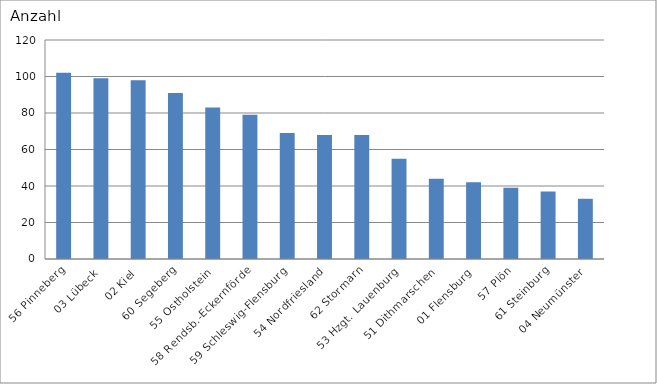
| Category | 56 Pinneberg 03 Lübeck 02 Kiel 60 Segeberg 55 Ostholstein 58 Rendsb.-Eckernförde 59 Schleswig-Flensburg 54 Nordfriesland 62 Stormarn 53 Hzgt. Lauenburg 51 Dithmarschen 01 Flensburg 57 Plön 61 Steinburg 04 Neumünster |
|---|---|
| 56 Pinneberg | 102 |
| 03 Lübeck | 99 |
| 02 Kiel | 98 |
| 60 Segeberg | 91 |
| 55 Ostholstein | 83 |
| 58 Rendsb.-Eckernförde | 79 |
| 59 Schleswig-Flensburg | 69 |
| 54 Nordfriesland | 68 |
| 62 Stormarn | 68 |
| 53 Hzgt. Lauenburg | 55 |
| 51 Dithmarschen | 44 |
| 01 Flensburg | 42 |
| 57 Plön | 39 |
| 61 Steinburg | 37 |
| 04 Neumünster | 33 |